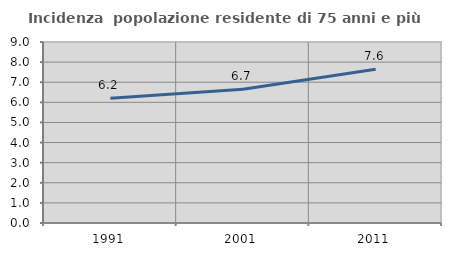
| Category | Incidenza  popolazione residente di 75 anni e più |
|---|---|
| 1991.0 | 6.209 |
| 2001.0 | 6.652 |
| 2011.0 | 7.642 |